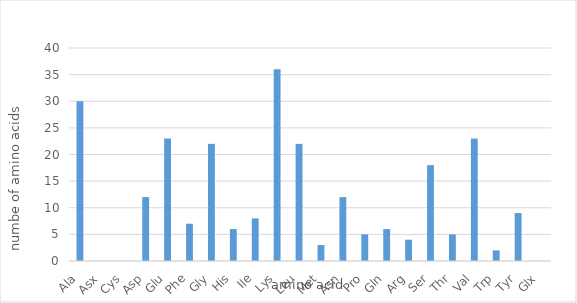
| Category | Series 0 |
|---|---|
| Ala | 30 |
| Asx | 0 |
| Cys | 0 |
| Asp | 12 |
| Glu | 23 |
| Phe | 7 |
| Gly | 22 |
| His | 6 |
| Ile | 8 |
| Lys | 36 |
| Leu | 22 |
| Met | 3 |
| Asn | 12 |
| Pro | 5 |
| Gln | 6 |
| Arg | 4 |
| Ser | 18 |
| Thr | 5 |
| Val | 23 |
| Trp | 2 |
| Tyr | 9 |
| Glx | 0 |